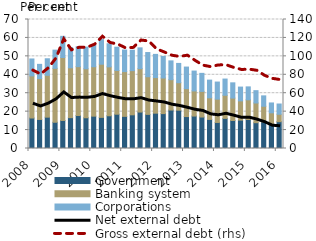
| Category | Government | Banking system | Corporations |
|---|---|---|---|
| 2008.0 | 16.55 | 22.844 | 9.191 |
| 2008.0 | 15.766 | 22.179 | 7.719 |
| 2008.0 | 17.007 | 22.712 | 8.98 |
| 2008.0 | 14.246 | 29.259 | 9.867 |
| 2009.0 | 15.21 | 34.154 | 11.496 |
| 2009.0 | 16.735 | 27.065 | 10.981 |
| 2009.0 | 17.914 | 26.501 | 10.83 |
| 2009.0 | 16.675 | 26.59 | 11.753 |
| 2010.0 | 17.55 | 26.815 | 11.633 |
| 2010.0 | 16.894 | 28.851 | 13.352 |
| 2010.0 | 17.766 | 26.539 | 12.517 |
| 2010.0 | 18.606 | 23.75 | 12.61 |
| 2011.0 | 17.436 | 24.288 | 11.704 |
| 2011.0 | 18.274 | 23.983 | 11.067 |
| 2011.0 | 19.774 | 23.555 | 11.29 |
| 2011.0 | 18.508 | 20.429 | 13.138 |
| 2012.0 | 19.179 | 19.318 | 12.578 |
| 2012.0 | 18.933 | 19.324 | 11.677 |
| 2012.0 | 20.862 | 16.469 | 10.216 |
| 2012.0 | 20.781 | 14.923 | 10.463 |
| 2013.0 | 17.333 | 15.148 | 11.71 |
| 2013.0 | 17.602 | 13.643 | 10.775 |
| 2013.0 | 17.076 | 13.896 | 9.805 |
| 2013.0 | 15.786 | 11.721 | 9.597 |
| 2014.0 | 14.132 | 12.679 | 9.25 |
| 2014.0 | 16.357 | 12.531 | 8.799 |
| 2014.0 | 15.198 | 12.164 | 8.271 |
| 2014.0 | 15.395 | 10.451 | 7.481 |
| 2015.0 | 15.722 | 10.693 | 7.021 |
| 2015.0 | 13.995 | 10.703 | 6.684 |
| 2015.0 | 14.446 | 8.477 | 5.638 |
| 2015.0 | 13.558 | 5.797 | 5.359 |
| 2016.0 | 14.544 | 4.05 | 5.55 |